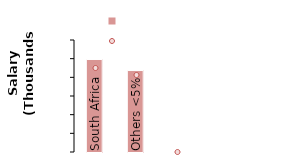
| Category | Avg Salary |
|---|---|
| South Africa | 49555.625 |
| Others <5% | 43636.019 |